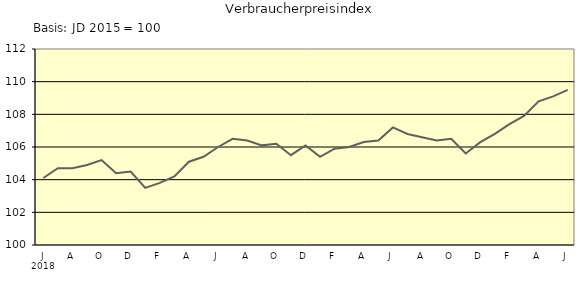
| Category | Series 0 |
|---|---|
| 0 | 104.1 |
| 1 | 104.7 |
| 2 | 104.7 |
| 3 | 104.9 |
| 4 | 105.2 |
| 5 | 104.4 |
| 6 | 104.5 |
| 7 | 103.5 |
| 8 | 103.8 |
| 9 | 104.2 |
| 10 | 105.1 |
| 11 | 105.4 |
| 12 | 106 |
| 13 | 106.5 |
| 14 | 106.4 |
| 15 | 106.1 |
| 16 | 106.2 |
| 17 | 105.5 |
| 18 | 106.1 |
| 19 | 105.4 |
| 20 | 105.9 |
| 21 | 106 |
| 22 | 106.3 |
| 23 | 106.4 |
| 24 | 107.2 |
| 25 | 106.8 |
| 26 | 106.6 |
| 27 | 106.4 |
| 28 | 106.5 |
| 29 | 105.6 |
| 30 | 106.3 |
| 31 | 106.8 |
| 32 | 107.4 |
| 33 | 107.9 |
| 34 | 108.8 |
| 35 | 109.1 |
| 36 | 109.5 |